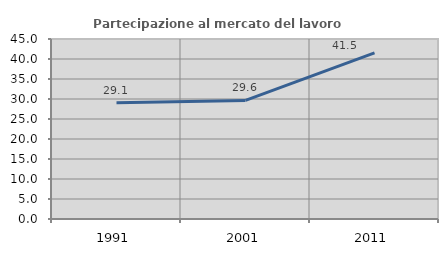
| Category | Partecipazione al mercato del lavoro  femminile |
|---|---|
| 1991.0 | 29.085 |
| 2001.0 | 29.638 |
| 2011.0 | 41.527 |